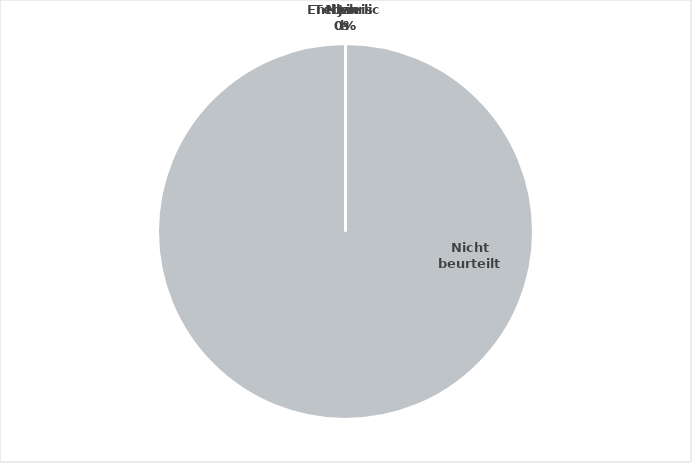
| Category | Series 0 |
|---|---|
| Ja | 0 |
| Nein  | 0 |
| Teilweise | 0 |
| Entbehrlich | 0 |
| Nicht beurteilt | 1597 |